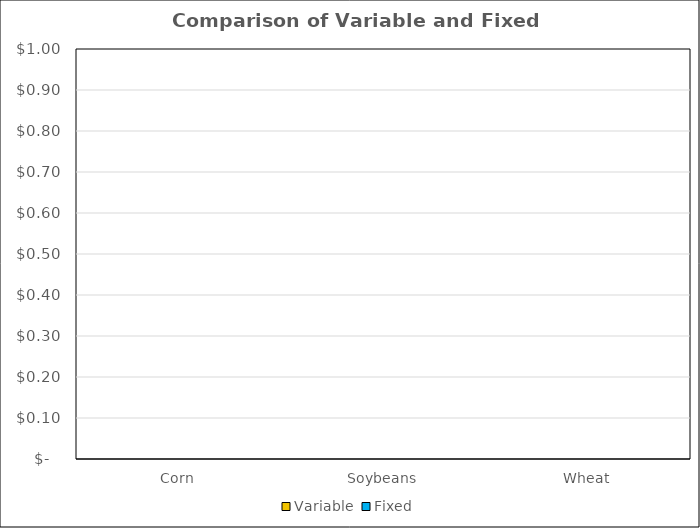
| Category | Variable | Fixed | Variable & Fixed |
|---|---|---|---|
| Corn | 0 | 0 |  |
| Soybeans | 0 | 0 |  |
| Wheat | 0 | 0 |  |